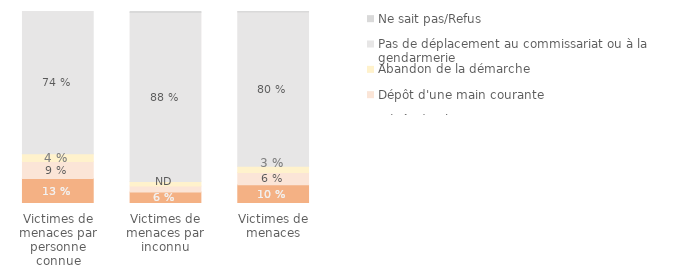
| Category | Dépôt de plainte | Dépôt d'une main courante | Abandon de la démarche | Pas de déplacement au commissariat ou à la gendarmerie | Ne sait pas/Refus |
|---|---|---|---|---|---|
| Victimes de menaces par personne connue | 0.13 | 0.089 | 0.04 | 0.741 | 0 |
| Victimes de menaces par inconnu | 0.059 | 0.031 | 0.024 | 0.88 | 0.006 |
| Victimes de menaces | 0.098 | 0.063 | 0.033 | 0.804 | 0.003 |